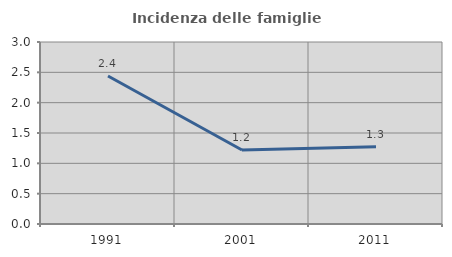
| Category | Incidenza delle famiglie numerose |
|---|---|
| 1991.0 | 2.439 |
| 2001.0 | 1.22 |
| 2011.0 | 1.274 |